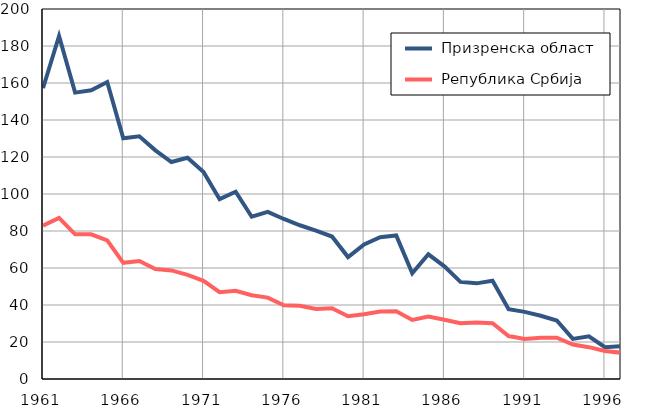
| Category |  Призренска област |  Република Србија |
|---|---|---|
| 1961.0 | 157.2 | 82.9 |
| 1962.0 | 185.4 | 87.1 |
| 1963.0 | 154.8 | 78.2 |
| 1964.0 | 156.1 | 78.2 |
| 1965.0 | 160.5 | 74.9 |
| 1966.0 | 130.1 | 62.8 |
| 1967.0 | 131.2 | 63.8 |
| 1968.0 | 123.6 | 59.4 |
| 1969.0 | 117.3 | 58.7 |
| 1970.0 | 119.6 | 56.3 |
| 1971.0 | 111.9 | 53.1 |
| 1972.0 | 97.2 | 46.9 |
| 1973.0 | 101.2 | 47.7 |
| 1974.0 | 87.7 | 45.3 |
| 1975.0 | 90.3 | 44 |
| 1976.0 | 86.5 | 39.9 |
| 1977.0 | 83.1 | 39.6 |
| 1978.0 | 80.2 | 37.8 |
| 1979.0 | 77 | 38.2 |
| 1980.0 | 65.9 | 33.9 |
| 1981.0 | 72.7 | 35 |
| 1982.0 | 76.6 | 36.5 |
| 1983.0 | 77.6 | 36.6 |
| 1984.0 | 57.2 | 31.9 |
| 1985.0 | 67.4 | 33.7 |
| 1986.0 | 60.9 | 32 |
| 1987.0 | 52.5 | 30.2 |
| 1988.0 | 51.7 | 30.5 |
| 1989.0 | 53.1 | 30.2 |
| 1990.0 | 37.7 | 23.2 |
| 1991.0 | 36.3 | 21.6 |
| 1992.0 | 34.2 | 22.3 |
| 1993.0 | 31.6 | 22.3 |
| 1994.0 | 21.7 | 18.6 |
| 1995.0 | 23.1 | 17.2 |
| 1996.0 | 17.2 | 15.1 |
| 1997.0 | 17.8 | 14.2 |